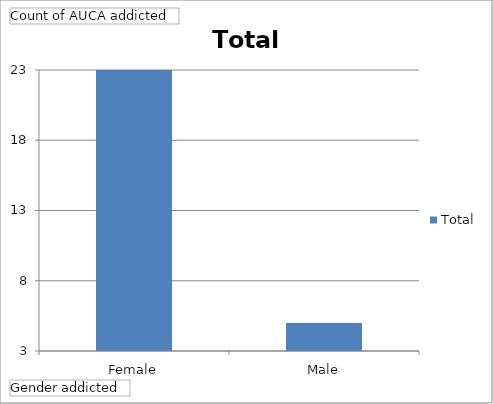
| Category | Total |
|---|---|
| Female | 23 |
| Male | 5 |